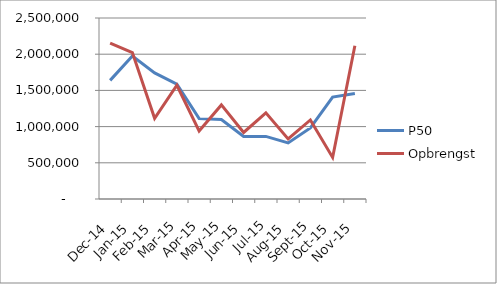
| Category | P50 | Opbrengst |
|---|---|---|
| 2014-12-01 | 1638350 | 2152500 |
| 2015-01-01 | 1974700 | 2023000 |
| 2015-02-01 | 1742200 | 1114350 |
| 2015-03-01 | 1587200 | 1570950 |
| 2015-04-01 | 1109800 | 939800 |
| 2015-05-01 | 1097400 | 1299700 |
| 2015-06-01 | 864900 | 918850 |
| 2015-07-01 | 864900 | 1189700 |
| 2015-08-01 | 775000 | 829100 |
| 2015-09-01 | 981150 | 1091500 |
| 2015-10-01 | 1407400 | 574200 |
| 2015-11-01 | 1458550 | 2117300 |